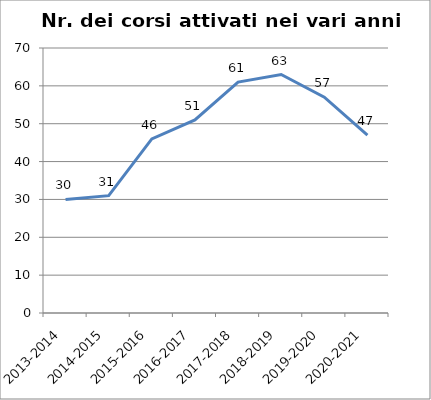
| Category | Nr. Corsi Attivati |
|---|---|
| 2013-2014 | 30 |
| 2014-2015 | 31 |
| 2015-2016 | 46 |
| 2016-2017 | 51 |
| 2017-2018 | 61 |
| 2018-2019 | 63 |
| 2019-2020 | 57 |
| 2020-2021 | 47 |